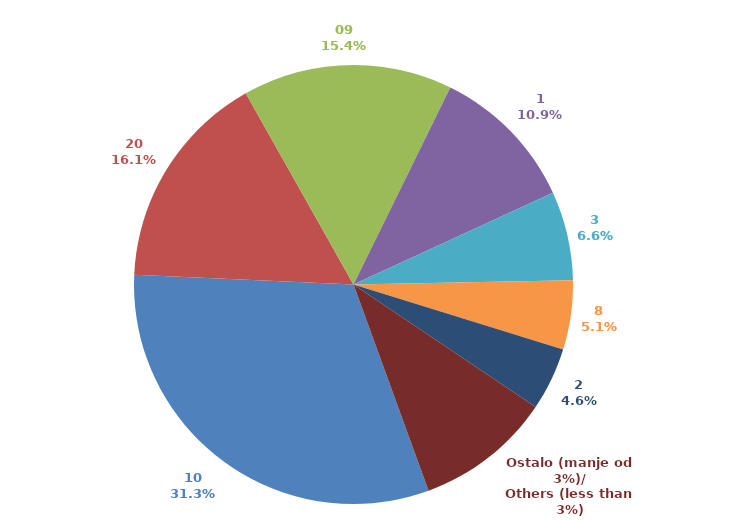
| Category | Series 0 |
|---|---|
| 10 | 0.313 |
| 20 | 0.161 |
| 09 | 0.154 |
| 1 | 0.109 |
| 3 | 0.065 |
| 8 | 0.051 |
| 2 | 0.046 |
| Ostalo (manje od 3%)/
Others (less than 3%) | 0.1 |